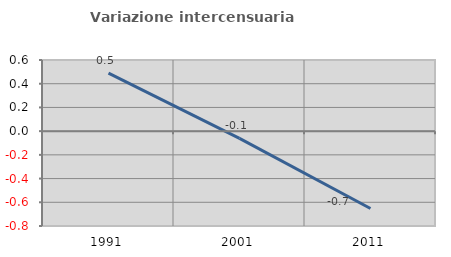
| Category | Variazione intercensuaria annua |
|---|---|
| 1991.0 | 0.489 |
| 2001.0 | -0.06 |
| 2011.0 | -0.653 |